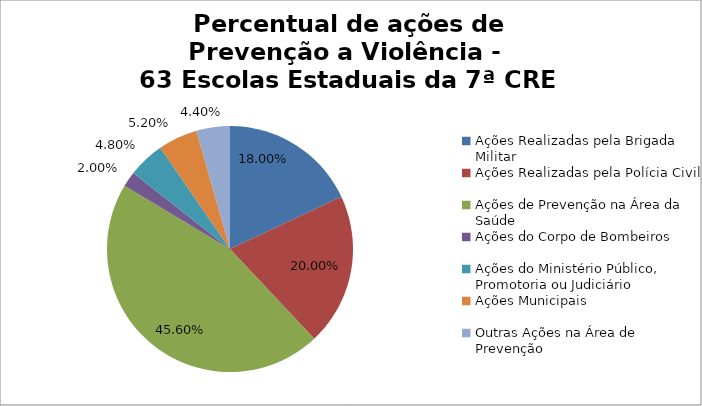
| Category | Percentual |
|---|---|
| Ações Realizadas pela Brigada Militar | 0.18 |
| Ações Realizadas pela Polícia Civil | 0.2 |
| Ações de Prevenção na Área da Saúde | 0.456 |
| Ações do Corpo de Bombeiros | 0.02 |
| Ações do Ministério Público, Promotoria ou Judiciário | 0.048 |
| Ações Municipais | 0.052 |
| Outras Ações na Área de Prevenção | 0.044 |